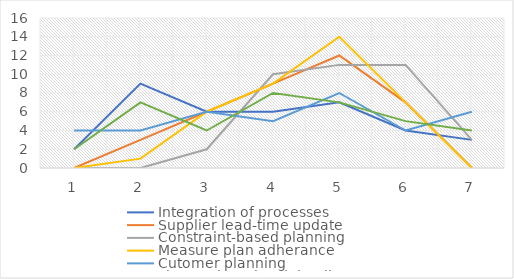
| Category | Integration of processes | Supplier lead-time update | Constraint-based planning | Measure plan adherance | Cutomer planning | Plans at item-level detail |
|---|---|---|---|---|---|---|
| 1.0 | 2 | 0 | 0 | 0 | 4 | 2 |
| 2.0 | 9 | 3 | 0 | 1 | 4 | 7 |
| 3.0 | 6 | 6 | 2 | 6 | 6 | 4 |
| 4.0 | 6 | 9 | 10 | 9 | 5 | 8 |
| 5.0 | 7 | 12 | 11 | 14 | 8 | 7 |
| 6.0 | 4 | 7 | 11 | 7 | 4 | 5 |
| 7.0 | 3 | 0 | 3 | 0 | 6 | 4 |